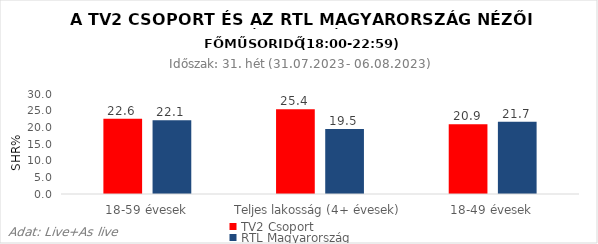
| Category | TV2 Csoport | RTL Magyarország |
|---|---|---|
| 18-59 évesek | 22.6 | 22.1 |
| Teljes lakosság (4+ évesek) | 25.4 | 19.5 |
| 18-49 évesek | 20.9 | 21.7 |